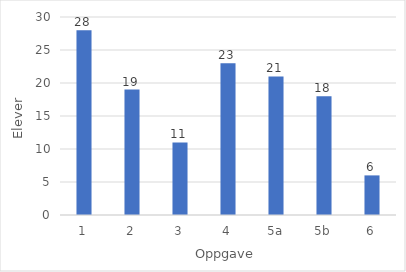
| Category | Series 0 |
|---|---|
| 1 | 28 |
| 2 | 19 |
| 3 | 11 |
| 4 | 23 |
| 5a | 21 |
| 5b | 18 |
| 6 | 6 |